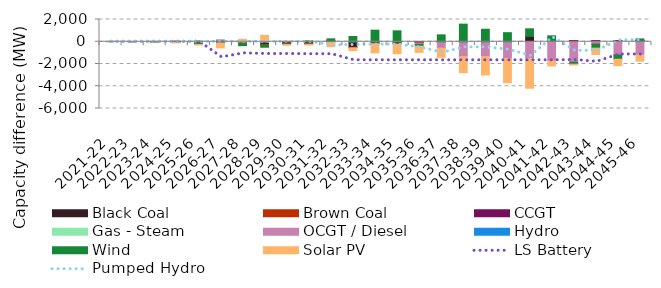
| Category | Black Coal | Brown Coal | CCGT | Gas - Steam | OCGT / Diesel | Hydro | Wind | Solar PV |
|---|---|---|---|---|---|---|---|---|
| 2021-22 | 0 | 0 | 0 | 0 | 0.001 | 0 | 0 | -0.006 |
| 2022-23 | 0 | 0 | 0.001 | 0 | 0.001 | 0 | 0.014 | -0.006 |
| 2023-24 | 0 | 0 | 0.001 | 0 | 0.001 | 0 | -27.195 | -0.006 |
| 2024-25 | 2.681 | 36.114 | 0.001 | 0 | 0.001 | 0 | -54.454 | -49.654 |
| 2025-26 | -53.853 | 45.104 | 0.001 | 0 | 0.001 | 0 | -184.743 | -49.654 |
| 2026-27 | 122.442 | 2.03 | 0.001 | 0 | 0.001 | 0 | -118.745 | -430.881 |
| 2027-28 | -21.068 | -130.691 | 0.001 | 0 | 0.001 | 0 | -199.443 | 217.803 |
| 2028-29 | -228.236 | -60.039 | 0.001 | 0 | 0.001 | 0 | -204.276 | 573.965 |
| 2029-30 | -143.691 | -60.039 | 0.001 | 0 | 0.001 | 0 | -41.088 | -70.184 |
| 2030-31 | -168.626 | -60.039 | 0.001 | 0 | 0.001 | 0 | 81.182 | -58.971 |
| 2031-32 | 106.59 | -60.039 | 0.001 | 0 | 0.001 | 0 | 154.961 | -386.906 |
| 2032-33 | -489.604 | -60.039 | 0.001 | 0 | 0.001 | 0 | 474.562 | -235.506 |
| 2033-34 | -122.554 | -60.039 | 0.001 | 0 | 0.002 | 0 | 1039.62 | -815.603 |
| 2034-35 | -163.051 | -60.039 | 0.001 | 0 | 0.002 | 0 | 981.963 | -845.487 |
| 2035-36 | -66.022 | -60.039 | 0.001 | 0 | -110.778 | 0 | -165.969 | -553.574 |
| 2036-37 | -66.024 | 0.02 | 0.001 | 0 | -521.447 | 0 | 619.332 | -818.707 |
| 2037-38 | 0.008 | 0.02 | 0.002 | 0 | -1337.18 | 0 | 1582.168 | -1436.146 |
| 2038-39 | 0.008 | 0.02 | 0.002 | 0 | -1337.18 | 0 | 1123.199 | -1648.939 |
| 2039-40 | 0.008 | 0.02 | 0.002 | 0 | -1502.577 | 0 | 815.758 | -2176.902 |
| 2040-41 | 495.082 | 0.02 | 0.002 | 0 | -1502.577 | 0 | 667.905 | -2676.398 |
| 2041-42 | 86.728 | 0.02 | 0.003 | 0 | -1720.91 | 0 | 446.308 | -452.628 |
| 2042-43 | 86.724 | 0.02 | 0.003 | 0 | -1836.061 | 0 | -181.131 | -65.023 |
| 2043-44 | 86.709 | 0.02 | 0.002 | 0 | -204.106 | 0 | -368.98 | -574.724 |
| 2044-45 | 86.711 | 0.02 | 0.002 | 0 | -1187.018 | 0 | -382.864 | -574.724 |
| 2045-46 | 86.71 | 0.005 | 0.002 | 0 | -1187.018 | 0 | 168.256 | -557.21 |